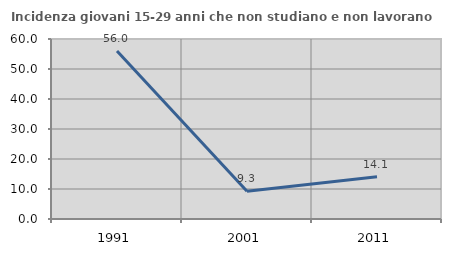
| Category | Incidenza giovani 15-29 anni che non studiano e non lavorano  |
|---|---|
| 1991.0 | 55.973 |
| 2001.0 | 9.258 |
| 2011.0 | 14.06 |